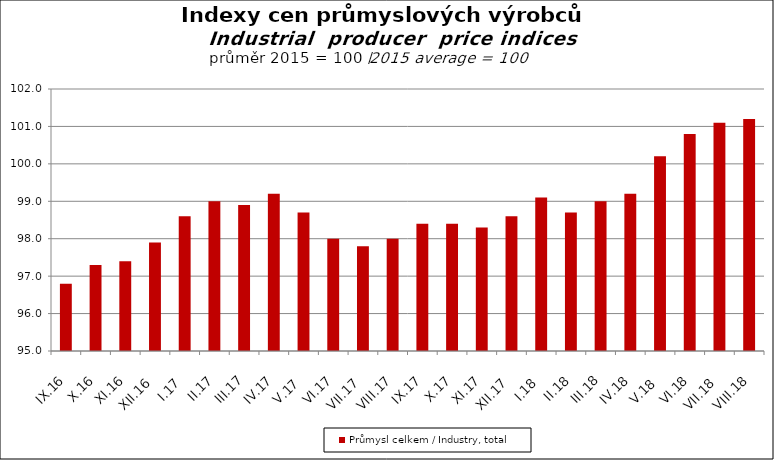
| Category | Průmysl celkem / Industry, total |
|---|---|
| IX.16 | 96.8 |
| X.16 | 97.3 |
| XI.16 | 97.4 |
| XII.16 | 97.9 |
| I.17 | 98.6 |
| II.17 | 99 |
| III.17 | 98.9 |
| IV.17 | 99.2 |
| V.17 | 98.7 |
| VI.17 | 98 |
| VII.17 | 97.8 |
| VIII.17 | 98 |
| IX.17 | 98.4 |
| X.17 | 98.4 |
| XI.17 | 98.3 |
| XII.17 | 98.6 |
| I.18 | 99.1 |
| II.18 | 98.7 |
| III.18 | 99 |
| IV.18 | 99.2 |
| V.18 | 100.2 |
| VI.18 | 100.8 |
| VII.18 | 101.1 |
| VIII.18 | 101.2 |